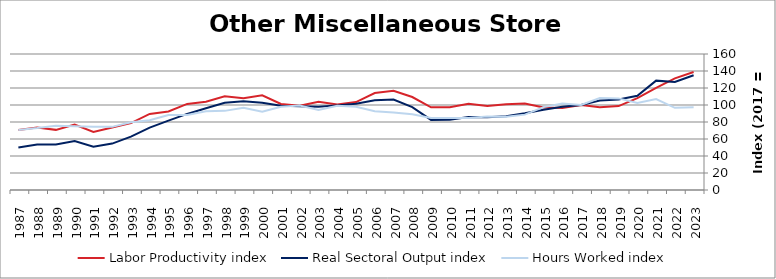
| Category | Labor Productivity index | Real Sectoral Output index | Hours Worked index |
|---|---|---|---|
| 2023.0 | 138.76 | 134.996 | 97.288 |
| 2022.0 | 131.356 | 127.057 | 96.727 |
| 2021.0 | 120.131 | 128.647 | 107.089 |
| 2020.0 | 108.178 | 110.781 | 102.406 |
| 2019.0 | 98.733 | 106.417 | 107.783 |
| 2018.0 | 97.259 | 105.294 | 108.261 |
| 2017.0 | 100 | 100 | 100 |
| 2016.0 | 96.469 | 98.03 | 101.618 |
| 2015.0 | 96.974 | 94.533 | 97.483 |
| 2014.0 | 101.815 | 90.265 | 88.656 |
| 2013.0 | 100.929 | 86.868 | 86.069 |
| 2012.0 | 98.975 | 85.581 | 86.467 |
| 2011.0 | 101.509 | 85.934 | 84.656 |
| 2010.0 | 97.377 | 82.616 | 84.841 |
| 2009.0 | 97.247 | 82.487 | 84.822 |
| 2008.0 | 109.377 | 97.421 | 89.07 |
| 2007.0 | 116.635 | 106.426 | 91.247 |
| 2006.0 | 114.015 | 105.61 | 92.628 |
| 2005.0 | 103.458 | 101.416 | 98.026 |
| 2004.0 | 100.573 | 99.561 | 98.994 |
| 2003.0 | 103.909 | 97.909 | 94.226 |
| 2002.0 | 99.152 | 98.581 | 99.424 |
| 2001.0 | 101.22 | 99.226 | 98.03 |
| 2000.0 | 111.436 | 102.678 | 92.141 |
| 1999.0 | 107.848 | 104.287 | 96.698 |
| 1998.0 | 110.161 | 102.548 | 93.089 |
| 1997.0 | 103.861 | 96.228 | 92.651 |
| 1996.0 | 101.296 | 89.497 | 88.352 |
| 1995.0 | 92.451 | 81.623 | 88.288 |
| 1994.0 | 89.535 | 73.417 | 81.998 |
| 1993.0 | 78.748 | 62.85 | 79.812 |
| 1992.0 | 73.5 | 54.602 | 74.288 |
| 1991.0 | 68.207 | 50.853 | 74.557 |
| 1990.0 | 77.025 | 57.668 | 74.87 |
| 1989.0 | 70.747 | 53.416 | 75.502 |
| 1988.0 | 73.529 | 53.549 | 72.827 |
| 1987.0 | 70.61 | 49.898 | 70.668 |